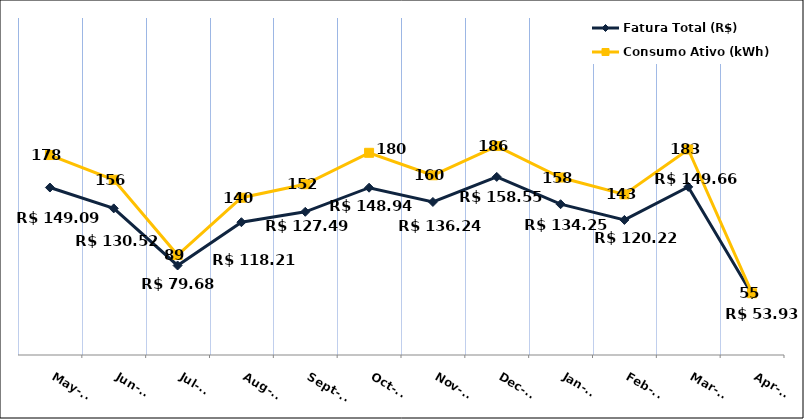
| Category | Fatura Total (R$) |
|---|---|
| 2023-05-01 | 149.09 |
| 2023-06-01 | 130.52 |
| 2023-07-01 | 79.68 |
| 2023-08-01 | 118.21 |
| 2023-09-01 | 127.49 |
| 2023-10-01 | 148.94 |
| 2023-11-01 | 136.24 |
| 2023-12-01 | 158.55 |
| 2024-01-01 | 134.25 |
| 2024-02-01 | 120.22 |
| 2024-03-01 | 149.66 |
| 2024-04-01 | 53.93 |